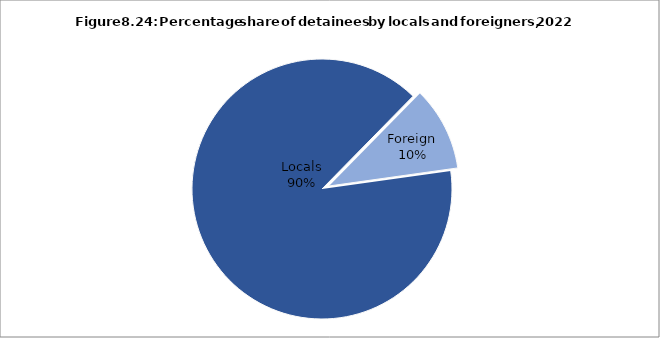
| Category | Series 0 |
|---|---|
| Locals | 2370 |
| Foreign | 276 |